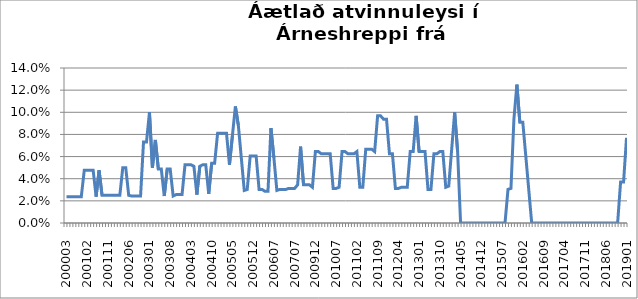
| Category | Series 0 |
|---|---|
| 200003 | 0.024 |
| 200004 | 0.024 |
| 200005 | 0.024 |
| 200010 | 0.024 |
| 200011 | 0.024 |
| 200012 | 0.024 |
| 200101 | 0.048 |
| 200102 | 0.048 |
| 200103 | 0.048 |
| 200104 | 0.048 |
| 200105 | 0.024 |
| 200106 | 0.048 |
| 200107 | 0.025 |
| 200108 | 0.025 |
| 200111 | 0.025 |
| 200112 | 0.025 |
| 200201 | 0.025 |
| 200202 | 0.025 |
| 200203 | 0.025 |
| 200204 | 0.05 |
| 200205 | 0.05 |
| 200206 | 0.025 |
| 200207 | 0.024 |
| 200208 | 0.024 |
| 200209 | 0.024 |
| 200210 | 0.024 |
| 200211 | 0.073 |
| 200212 | 0.073 |
| 200301 | 0.1 |
| 200302 | 0.05 |
| 200303 | 0.075 |
| 200304 | 0.049 |
| 200305 | 0.049 |
| 200306 | 0.024 |
| 200307 | 0.049 |
| 200308 | 0.049 |
| 200309 | 0.024 |
| 200310 | 0.026 |
| 200311 | 0.026 |
| 200312 | 0.026 |
| 200401 | 0.053 |
| 200402 | 0.053 |
| 200403 | 0.053 |
| 200404 | 0.051 |
| 200405 | 0.026 |
| 200406 | 0.051 |
| 200407 | 0.053 |
| 200408 | 0.053 |
| 200409 | 0.026 |
| 200410 | 0.054 |
| 200411 | 0.054 |
| 200412 | 0.081 |
| 200501 | 0.081 |
| 200502 | 0.081 |
| 200503 | 0.081 |
| 200504 | 0.053 |
| 200505 | 0.079 |
| 200506 | 0.105 |
| 200507 | 0.088 |
| 200508 | 0.059 |
| 200509 | 0.029 |
| 200510 | 0.03 |
| 200511 | 0.061 |
| 200512 | 0.061 |
| 200601 | 0.061 |
| 200602 | 0.03 |
| 200603 | 0.03 |
| 200604 | 0.029 |
| 200605 | 0.029 |
| 200606 | 0.086 |
| 200607 | 0.059 |
| 200608 | 0.029 |
| 200609 | 0.03 |
| 200610 | 0.03 |
| 200702 | 0.03 |
| 200703 | 0.031 |
| 200704 | 0.031 |
| 200707 | 0.031 |
| 200708 | 0.034 |
| 200709 | 0.069 |
| 200710 | 0.034 |
| 200711 | 0.034 |
| 200906 | 0.034 |
| 200911 | 0.032 |
| 200912 | 0.065 |
| 201001 | 0.065 |
| 201002 | 0.062 |
| 201003 | 0.062 |
| 201004 | 0.062 |
| 201005 | 0.062 |
| 201006 | 0.031 |
| 201007 | 0.031 |
| 201008 | 0.032 |
| 201009 | 0.065 |
| 201010 | 0.065 |
| 201011 | 0.062 |
| 201012 | 0.062 |
| 201101 | 0.062 |
| 201102 | 0.065 |
| 201103 | 0.032 |
| 201104 | 0.032 |
| 201105 | 0.067 |
| 201106 | 0.067 |
| 201107 | 0.067 |
| 201108 | 0.065 |
| 201109 | 0.097 |
| 201110 | 0.097 |
| 201111 | 0.094 |
| 201112 | 0.094 |
| 201201 | 0.062 |
| 201202 | 0.062 |
| 201203 | 0.031 |
| 201204 | 0.031 |
| 201205 | 0.032 |
| 201208 | 0.032 |
| 201209 | 0.032 |
| 201210 | 0.065 |
| 201211 | 0.065 |
| 201212 | 0.097 |
| 201301 | 0.065 |
| 201302 | 0.065 |
| 201303 | 0.065 |
| 201304 | 0.03 |
| 201305 | 0.03 |
| 201308 | 0.062 |
| 201309 | 0.062 |
| 201310 | 0.065 |
| 201311 | 0.065 |
| 201312 | 0.032 |
| 201401 | 0.033 |
| 201402 | 0.067 |
| 201403 | 0.1 |
| 201404 | 0.065 |
| 201405 | 0 |
| 201406 | 0 |
| 201407 | 0 |
| 201408 | 0 |
| 201409 | 0 |
| 201410 | 0 |
| 201411 | 0 |
| 201412 | 0 |
| 201501 | 0 |
| 201502 | 0 |
| 201503 | 0 |
| 201504 | 0 |
| 201505 | 0 |
| 201506 | 0 |
| 201507 | 0 |
| 201508 | 0 |
| 201509 | 0.03 |
| 201510 | 0.031 |
| 201511 | 0.094 |
| 201512 | 0.125 |
| 201601 | 0.091 |
| 201602 | 0.091 |
| 201603 | 0.061 |
| 201604 | 0.03 |
| 201605 | 0 |
| 201606 | 0 |
| 201607 | 0 |
| 201608 | 0 |
| 201609 | 0 |
| 201610 | 0 |
| 201611 | 0 |
| 201612 | 0 |
| 201701 | 0 |
| 201702 | 0 |
| 201703 | 0 |
| 201704 | 0 |
| 201705 | 0 |
| 201706 | 0 |
| 201707 | 0 |
| 201708 | 0 |
| 201709 | 0 |
| 201710 | 0 |
| 201711 | 0 |
| 201712 | 0 |
| 201801 | 0 |
| 201802 | 0 |
| 201803 | 0 |
| 201804 | 0 |
| 201805 | 0 |
| 201806 | 0 |
| 201807 | 0 |
| 201808 | 0 |
| 201809 | 0 |
| 201810 | 0 |
| 201811 | 0.037 |
| 201812 | 0.037 |
| 201901 | 0.077 |